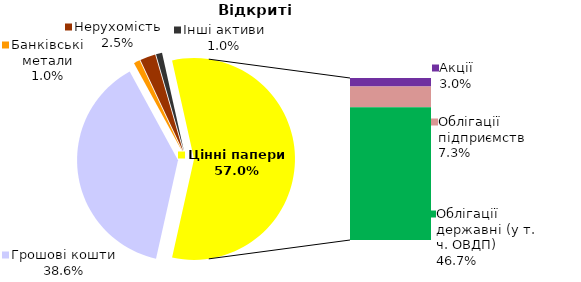
| Category | Відкриті |
|---|---|
| Грошові кошти | 382.286 |
| Банківські метали | 9.809 |
| Нерухомість | 24.658 |
| Інші активи | 9.677 |
| Акції | 29.603 |
| Облігації підприємств | 72.828 |
| Муніципальні облігації | 0 |
| Облігації державні (у т. ч. ОВДП) | 462.677 |